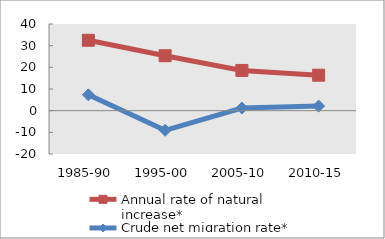
| Category | Annual rate of natural increase* | Crude net migration rate* |
|---|---|---|
| 1985-90 | 32.481 | 7.306 |
| 1995-00 | 25.358 | -9.061 |
| 2005-10 | 18.566 | 1.21 |
| 2010-15 | 16.372 | 2.1 |